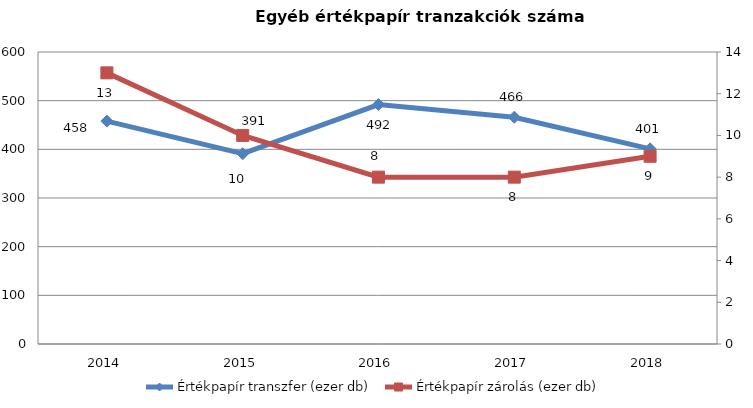
| Category | Értékpapír transzfer (ezer db) |
|---|---|
| 2014.0 | 458 |
| 2015.0 | 391 |
| 2016.0 | 492 |
| 2017.0 | 466 |
| 2018.0 | 401 |